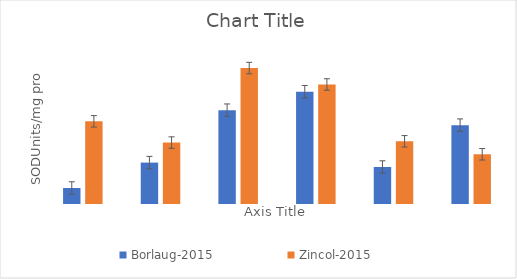
| Category | Borlaug-2015 | Zincol-2015 |
|---|---|---|
| Control | 3.06 | 15.793 |
| 0.1 Mm JA | 7.913 | 11.742 |
| 1 mM JA | 17.933 | 25.975 |
| Aphid  | 21.46 | 22.836 |
| 0.1 mM + aphid | 7.066 | 11.978 |
| 1 mM JA + aphid | 15.069 | 9.501 |